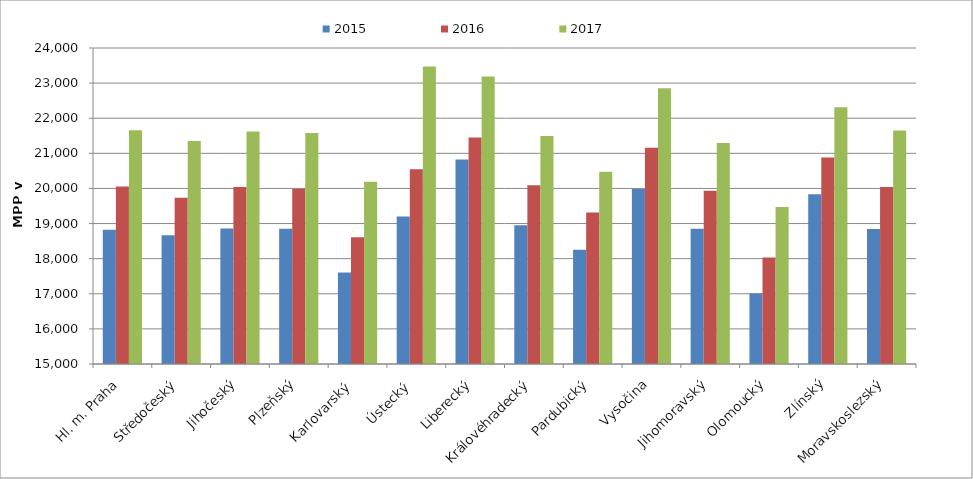
| Category | 2015 | 2016 | 2017 |
|---|---|---|---|
| Hl. m. Praha | 18820.912 | 20051.91 | 21656.656 |
| Středočeský | 18667.039 | 19734.577 | 21349.412 |
| Jihočeský | 18860.057 | 20044.593 | 21624.954 |
| Plzeňský | 18849.97 | 19983.264 | 21582.068 |
| Karlovarský  | 17606.899 | 18613.008 | 20194.035 |
| Ústecký   | 19200.762 | 20544 | 23475.975 |
| Liberecký | 20821.561 | 21450.058 | 23191.231 |
| Královéhradecký | 18954.839 | 20092.473 | 21491.039 |
| Pardubický | 18254.056 | 19313.277 | 20476.848 |
| Vysočina | 19985.985 | 21162.441 | 22855.65 |
| Jihomoravský | 18854.883 | 19935.53 | 21292.271 |
| Olomoucký | 17009.646 | 18030.225 | 19472.669 |
| Zlínský | 19835.602 | 20879.151 | 22309.744 |
| Moravskoslezský | 18844.378 | 20041.289 | 21648.767 |